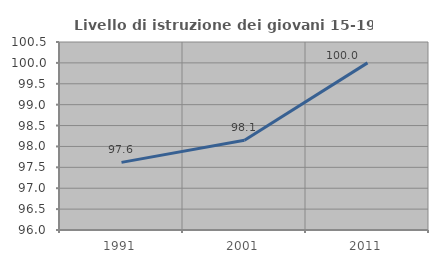
| Category | Livello di istruzione dei giovani 15-19 anni |
|---|---|
| 1991.0 | 97.619 |
| 2001.0 | 98.148 |
| 2011.0 | 100 |